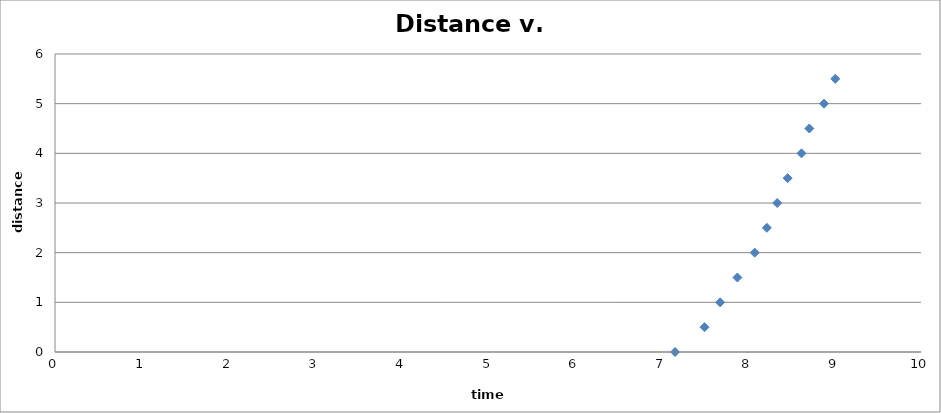
| Category | distance (m) |
|---|---|
| 7.16 | 0 |
| 7.5 | 0.5 |
| 7.68 | 1 |
| 7.88 | 1.5 |
| 8.08 | 2 |
| 8.22 | 2.5 |
| 8.34 | 3 |
| 8.46 | 3.5 |
| 8.62 | 4 |
| 8.71 | 4.5 |
| 8.88 | 5 |
| 9.01 | 5.5 |